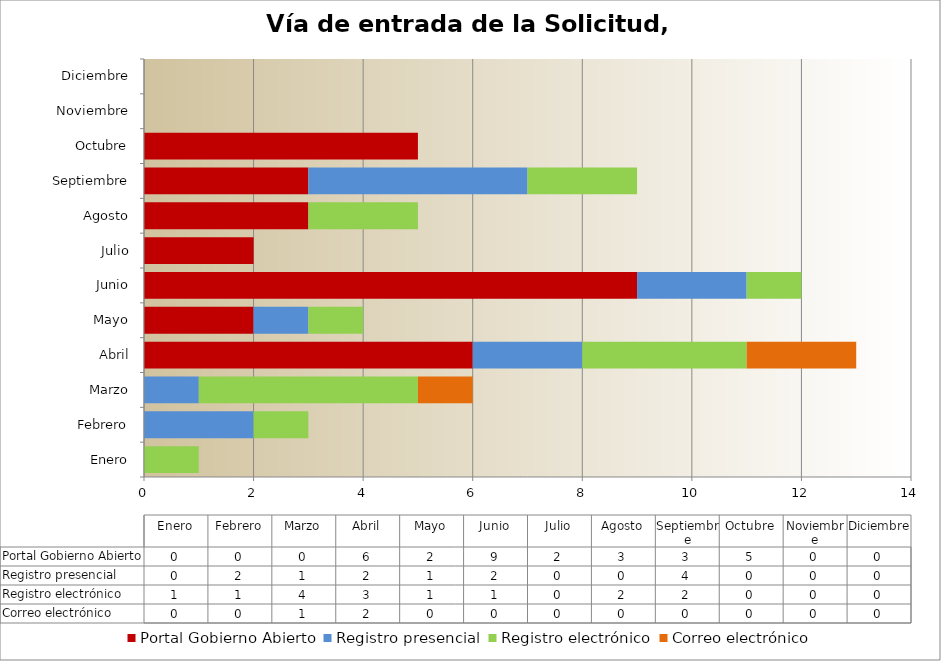
| Category | Portal Gobierno Abierto | Registro presencial | Registro electrónico | Correo electrónico |
|---|---|---|---|---|
| Enero | 0 | 0 | 1 | 0 |
| Febrero | 0 | 2 | 1 | 0 |
| Marzo | 0 | 1 | 4 | 1 |
| Abril | 6 | 2 | 3 | 2 |
| Mayo | 2 | 1 | 1 | 0 |
| Junio | 9 | 2 | 1 | 0 |
| Julio | 2 | 0 | 0 | 0 |
| Agosto | 3 | 0 | 2 | 0 |
| Septiembre | 3 | 4 | 2 | 0 |
| Octubre | 5 | 0 | 0 | 0 |
| Noviembre | 0 | 0 | 0 | 0 |
| Diciembre | 0 | 0 | 0 | 0 |